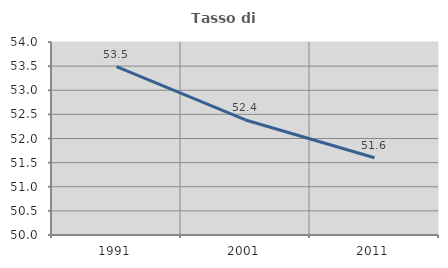
| Category | Tasso di occupazione   |
|---|---|
| 1991.0 | 53.489 |
| 2001.0 | 52.384 |
| 2011.0 | 51.601 |